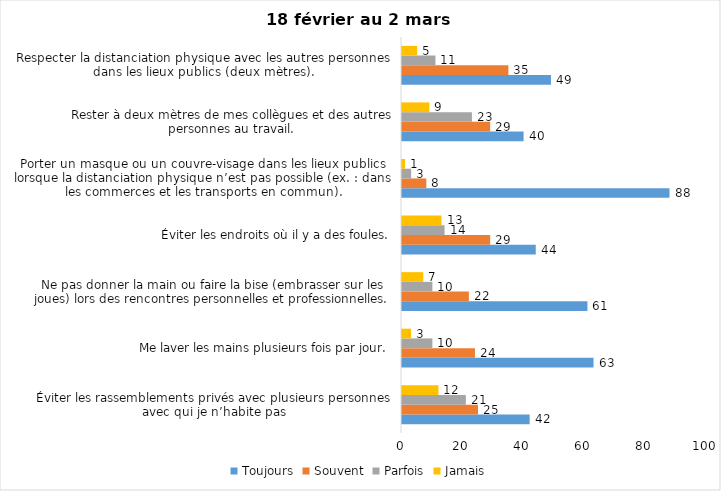
| Category | Toujours | Souvent | Parfois | Jamais |
|---|---|---|---|---|
| Éviter les rassemblements privés avec plusieurs personnes avec qui je n’habite pas | 42 | 25 | 21 | 12 |
| Me laver les mains plusieurs fois par jour. | 63 | 24 | 10 | 3 |
| Ne pas donner la main ou faire la bise (embrasser sur les joues) lors des rencontres personnelles et professionnelles. | 61 | 22 | 10 | 7 |
| Éviter les endroits où il y a des foules. | 44 | 29 | 14 | 13 |
| Porter un masque ou un couvre-visage dans les lieux publics lorsque la distanciation physique n’est pas possible (ex. : dans les commerces et les transports en commun). | 88 | 8 | 3 | 1 |
| Rester à deux mètres de mes collègues et des autres personnes au travail. | 40 | 29 | 23 | 9 |
| Respecter la distanciation physique avec les autres personnes dans les lieux publics (deux mètres). | 49 | 35 | 11 | 5 |